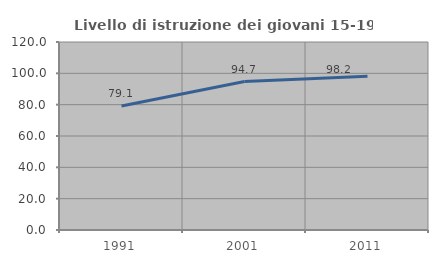
| Category | Livello di istruzione dei giovani 15-19 anni |
|---|---|
| 1991.0 | 79.134 |
| 2001.0 | 94.747 |
| 2011.0 | 98.159 |